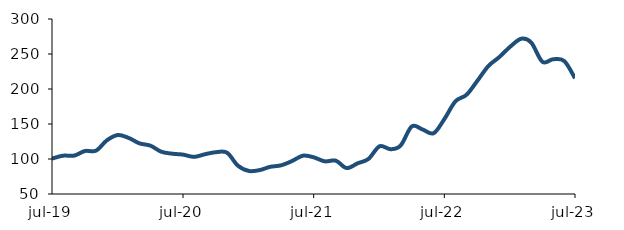
| Category | Series 0 |
|---|---|
| 2019-07-01 | 100.551 |
| 2019-08-01 | 104.741 |
| 2019-09-01 | 104.835 |
| 2019-10-01 | 111.409 |
| 2019-11-01 | 111.925 |
| 2019-12-01 | 126.529 |
| 2020-01-01 | 134.255 |
| 2020-02-01 | 129.901 |
| 2020-03-01 | 122.394 |
| 2020-04-01 | 119.057 |
| 2020-05-01 | 110.456 |
| 2020-06-01 | 107.554 |
| 2020-07-01 | 106.253 |
| 2020-08-01 | 103.049 |
| 2020-09-01 | 106.902 |
| 2020-10-01 | 109.711 |
| 2020-11-01 | 109.011 |
| 2020-12-01 | 90.634 |
| 2021-01-01 | 82.908 |
| 2021-02-01 | 84.275 |
| 2021-03-01 | 88.757 |
| 2021-04-01 | 90.964 |
| 2021-05-01 | 96.958 |
| 2021-06-01 | 104.739 |
| 2021-07-01 | 102.396 |
| 2021-08-01 | 96.652 |
| 2021-09-01 | 97.59 |
| 2021-10-01 | 87.03 |
| 2021-11-01 | 93.888 |
| 2021-12-01 | 100.079 |
| 2022-01-01 | 118.131 |
| 2022-02-01 | 113.977 |
| 2022-03-01 | 119.323 |
| 2022-04-01 | 146.553 |
| 2022-05-01 | 142.197 |
| 2022-06-01 | 136.794 |
| 2022-07-01 | 156.982 |
| 2022-08-01 | 182.397 |
| 2022-09-01 | 191.729 |
| 2022-10-01 | 211.533 |
| 2022-11-01 | 232.804 |
| 2022-12-01 | 245.403 |
| 2023-01-01 | 260.441 |
| 2023-02-01 | 271.834 |
| 2023-03-01 | 266.191 |
| 2023-04-01 | 238.855 |
| 2023-05-01 | 242.503 |
| 2023-06-01 | 239.935 |
| 2023-07-01 | 215.329 |